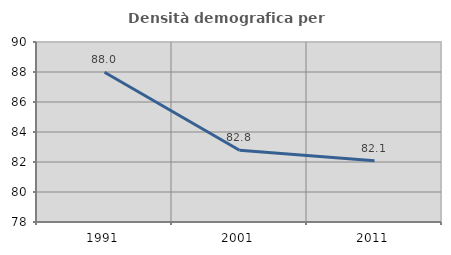
| Category | Densità demografica |
|---|---|
| 1991.0 | 87.987 |
| 2001.0 | 82.782 |
| 2011.0 | 82.081 |